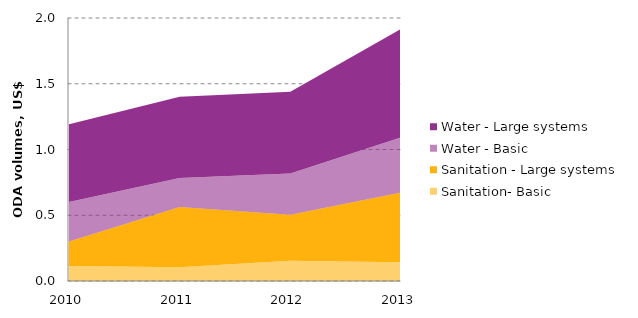
| Category | Sanitation- Basic | Sanitation - Large systems | Water - Basic | Water - Large systems |
|---|---|---|---|---|
| 2010 | 0.113 | 0.187 | 0.3 | 0.59 |
| 2011 | 0.105 | 0.458 | 0.22 | 0.618 |
| 2012 | 0.153 | 0.35 | 0.314 | 0.622 |
| 2013 | 0.143 | 0.529 | 0.42 | 0.825 |